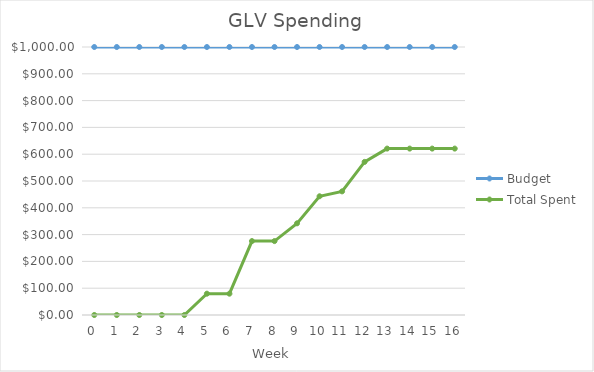
| Category | Budget | Total Spent |
|---|---|---|
| 0.0 | 1000 | 0 |
| 1.0 | 1000 | 0 |
| 2.0 | 1000 | 0 |
| 3.0 | 1000 | 0 |
| 4.0 | 1000 | 0 |
| 5.0 | 1000 | 79.55 |
| 6.0 | 1000 | 79.55 |
| 7.0 | 1000 | 275.82 |
| 8.0 | 1000 | 275.82 |
| 9.0 | 1000 | 342.03 |
| 10.0 | 1000 | 443 |
| 11.0 | 1000 | 461.34 |
| 12.0 | 1000 | 571.29 |
| 13.0 | 1000 | 620.9 |
| 14.0 | 1000 | 620.9 |
| 15.0 | 1000 | 620.9 |
| 16.0 | 1000 | 620.9 |